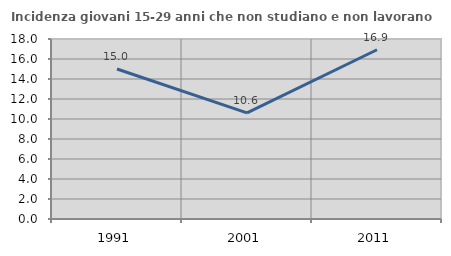
| Category | Incidenza giovani 15-29 anni che non studiano e non lavorano  |
|---|---|
| 1991.0 | 15 |
| 2001.0 | 10.606 |
| 2011.0 | 16.923 |